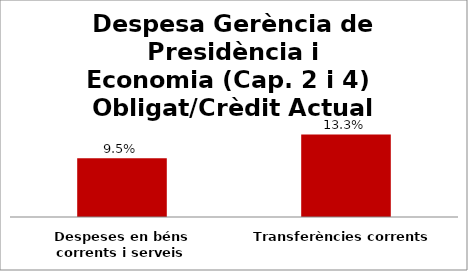
| Category | Series 0 |
|---|---|
| Despeses en béns corrents i serveis | 0.095 |
| Transferències corrents | 0.133 |